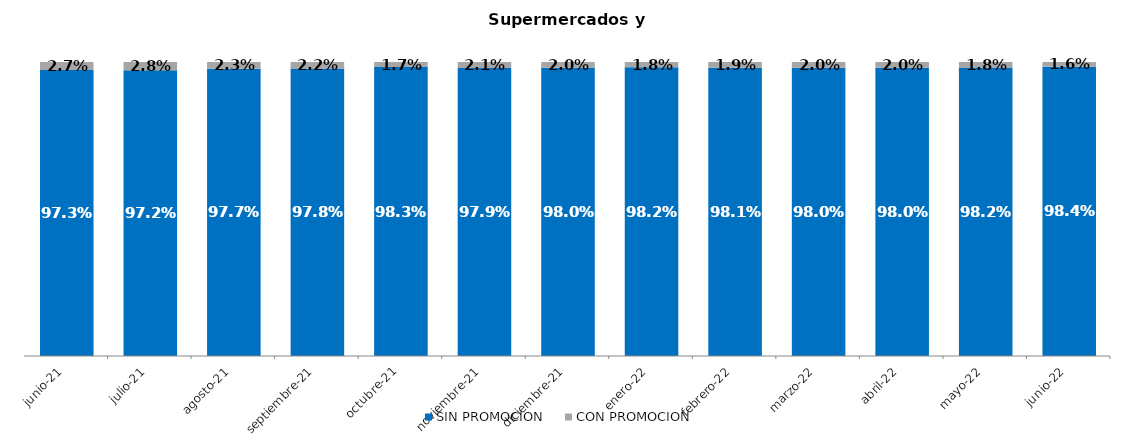
| Category | SIN PROMOCION   | CON PROMOCION   |
|---|---|---|
| 2021-06-01 | 0.973 | 0.027 |
| 2021-07-01 | 0.972 | 0.028 |
| 2021-08-01 | 0.977 | 0.023 |
| 2021-09-01 | 0.978 | 0.022 |
| 2021-10-01 | 0.983 | 0.017 |
| 2021-11-01 | 0.979 | 0.021 |
| 2021-12-01 | 0.98 | 0.02 |
| 2022-01-01 | 0.982 | 0.018 |
| 2022-02-01 | 0.981 | 0.019 |
| 2022-03-01 | 0.98 | 0.02 |
| 2022-04-01 | 0.98 | 0.02 |
| 2022-05-01 | 0.982 | 0.018 |
| 2022-06-01 | 0.984 | 0.016 |